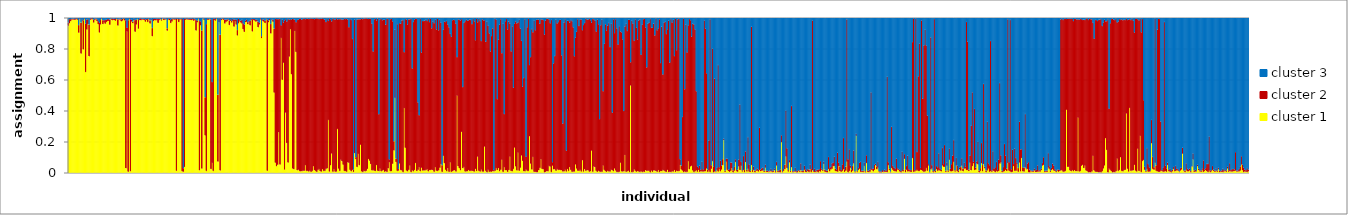
| Category | cluster 1 | cluster 2 | cluster 3 |
|---|---|---|---|
| 0 | 0.949 | 0.02 | 0.031 |
| 1 | 0.965 | 0.026 | 0.009 |
| 2 | 0.978 | 0.013 | 0.009 |
| 3 | 0.988 | 0.006 | 0.006 |
| 4 | 0.989 | 0.006 | 0.004 |
| 5 | 0.987 | 0.006 | 0.007 |
| 6 | 0.988 | 0.008 | 0.004 |
| 7 | 0.991 | 0.005 | 0.004 |
| 8 | 0.988 | 0.007 | 0.005 |
| 9 | 0.904 | 0.049 | 0.047 |
| 10 | 0.99 | 0.006 | 0.004 |
| 11 | 0.769 | 0.199 | 0.032 |
| 12 | 0.981 | 0.009 | 0.01 |
| 13 | 0.796 | 0.187 | 0.018 |
| 14 | 0.991 | 0.005 | 0.004 |
| 15 | 0.65 | 0.312 | 0.037 |
| 16 | 0.924 | 0.064 | 0.013 |
| 17 | 0.959 | 0.032 | 0.009 |
| 18 | 0.752 | 0.203 | 0.045 |
| 19 | 0.987 | 0.009 | 0.005 |
| 20 | 0.99 | 0.006 | 0.004 |
| 21 | 0.991 | 0.006 | 0.003 |
| 22 | 0.969 | 0.018 | 0.013 |
| 23 | 0.986 | 0.008 | 0.006 |
| 24 | 0.991 | 0.005 | 0.003 |
| 25 | 0.977 | 0.014 | 0.008 |
| 26 | 0.958 | 0.021 | 0.02 |
| 27 | 0.905 | 0.063 | 0.031 |
| 28 | 0.957 | 0.029 | 0.014 |
| 29 | 0.992 | 0.005 | 0.004 |
| 30 | 0.959 | 0.025 | 0.016 |
| 31 | 0.973 | 0.011 | 0.016 |
| 32 | 0.962 | 0.024 | 0.013 |
| 33 | 0.972 | 0.016 | 0.012 |
| 34 | 0.979 | 0.012 | 0.009 |
| 35 | 0.98 | 0.011 | 0.009 |
| 36 | 0.955 | 0.033 | 0.011 |
| 37 | 0.992 | 0.005 | 0.003 |
| 38 | 0.984 | 0.011 | 0.005 |
| 39 | 0.987 | 0.007 | 0.005 |
| 40 | 0.985 | 0.01 | 0.005 |
| 41 | 0.981 | 0.011 | 0.008 |
| 42 | 0.991 | 0.005 | 0.004 |
| 43 | 0.95 | 0.04 | 0.009 |
| 44 | 0.987 | 0.005 | 0.007 |
| 45 | 0.989 | 0.006 | 0.004 |
| 46 | 0.977 | 0.012 | 0.011 |
| 47 | 0.982 | 0.012 | 0.005 |
| 48 | 0.991 | 0.005 | 0.004 |
| 49 | 0.983 | 0.012 | 0.005 |
| 50 | 0.029 | 0.955 | 0.016 |
| 51 | 0.912 | 0.024 | 0.064 |
| 52 | 0.007 | 0.977 | 0.016 |
| 53 | 0.99 | 0.006 | 0.004 |
| 54 | 0.01 | 0.98 | 0.01 |
| 55 | 0.976 | 0.011 | 0.012 |
| 56 | 0.965 | 0.01 | 0.025 |
| 57 | 0.984 | 0.009 | 0.006 |
| 58 | 0.91 | 0.075 | 0.015 |
| 59 | 0.957 | 0.03 | 0.013 |
| 60 | 0.99 | 0.004 | 0.006 |
| 61 | 0.93 | 0.056 | 0.014 |
| 62 | 0.986 | 0.008 | 0.006 |
| 63 | 0.984 | 0.012 | 0.004 |
| 64 | 0.988 | 0.005 | 0.007 |
| 65 | 0.988 | 0.006 | 0.006 |
| 66 | 0.986 | 0.008 | 0.006 |
| 67 | 0.975 | 0.014 | 0.01 |
| 68 | 0.987 | 0.007 | 0.006 |
| 69 | 0.973 | 0.019 | 0.008 |
| 70 | 0.99 | 0.006 | 0.005 |
| 71 | 0.963 | 0.02 | 0.018 |
| 72 | 0.987 | 0.007 | 0.005 |
| 73 | 0.881 | 0.053 | 0.066 |
| 74 | 0.979 | 0.015 | 0.006 |
| 75 | 0.985 | 0.008 | 0.007 |
| 76 | 0.983 | 0.01 | 0.007 |
| 77 | 0.987 | 0.008 | 0.005 |
| 78 | 0.967 | 0.027 | 0.006 |
| 79 | 0.986 | 0.007 | 0.006 |
| 80 | 0.99 | 0.006 | 0.004 |
| 81 | 0.982 | 0.007 | 0.01 |
| 82 | 0.992 | 0.004 | 0.003 |
| 83 | 0.985 | 0.01 | 0.006 |
| 84 | 0.988 | 0.006 | 0.006 |
| 85 | 0.991 | 0.005 | 0.005 |
| 86 | 0.917 | 0.015 | 0.068 |
| 87 | 0.989 | 0.006 | 0.005 |
| 88 | 0.985 | 0.01 | 0.005 |
| 89 | 0.966 | 0.02 | 0.013 |
| 90 | 0.976 | 0.018 | 0.005 |
| 91 | 0.99 | 0.005 | 0.005 |
| 92 | 0.988 | 0.007 | 0.005 |
| 93 | 0.989 | 0.006 | 0.005 |
| 94 | 0.013 | 0.982 | 0.005 |
| 95 | 0.99 | 0.005 | 0.006 |
| 96 | 0.972 | 0.02 | 0.008 |
| 97 | 0.988 | 0.006 | 0.006 |
| 98 | 0.99 | 0.005 | 0.005 |
| 99 | 0.009 | 0.986 | 0.005 |
| 100 | 0.007 | 0.022 | 0.971 |
| 101 | 0.038 | 0.957 | 0.005 |
| 102 | 0.987 | 0.007 | 0.006 |
| 103 | 0.99 | 0.006 | 0.004 |
| 104 | 0.988 | 0.007 | 0.005 |
| 105 | 0.987 | 0.006 | 0.008 |
| 106 | 0.987 | 0.008 | 0.005 |
| 107 | 0.986 | 0.008 | 0.006 |
| 108 | 0.989 | 0.007 | 0.004 |
| 109 | 0.981 | 0.011 | 0.008 |
| 110 | 0.987 | 0.007 | 0.005 |
| 111 | 0.918 | 0.068 | 0.014 |
| 112 | 0.971 | 0.01 | 0.019 |
| 113 | 0.992 | 0.004 | 0.005 |
| 114 | 0.016 | 0.963 | 0.021 |
| 115 | 0.951 | 0.026 | 0.024 |
| 116 | 0.027 | 0.891 | 0.082 |
| 117 | 0.993 | 0.004 | 0.003 |
| 118 | 0.986 | 0.009 | 0.005 |
| 119 | 0.241 | 0.246 | 0.513 |
| 120 | 0.012 | 0.947 | 0.041 |
| 121 | 0.988 | 0.007 | 0.005 |
| 122 | 0.987 | 0.006 | 0.007 |
| 123 | 0.991 | 0.004 | 0.005 |
| 124 | 0.024 | 0.966 | 0.01 |
| 125 | 0.064 | 0.521 | 0.416 |
| 126 | 0.012 | 0.983 | 0.006 |
| 127 | 0.986 | 0.009 | 0.005 |
| 128 | 0.982 | 0.009 | 0.009 |
| 129 | 0.991 | 0.005 | 0.003 |
| 130 | 0.072 | 0.431 | 0.497 |
| 131 | 0.971 | 0.024 | 0.005 |
| 132 | 0.015 | 0.876 | 0.109 |
| 133 | 0.985 | 0.009 | 0.005 |
| 134 | 0.991 | 0.004 | 0.005 |
| 135 | 0.987 | 0.009 | 0.005 |
| 136 | 0.963 | 0.026 | 0.011 |
| 137 | 0.973 | 0.015 | 0.012 |
| 138 | 0.979 | 0.011 | 0.01 |
| 139 | 0.988 | 0.006 | 0.006 |
| 140 | 0.953 | 0.029 | 0.018 |
| 141 | 0.98 | 0.01 | 0.01 |
| 142 | 0.969 | 0.011 | 0.019 |
| 143 | 0.979 | 0.014 | 0.008 |
| 144 | 0.943 | 0.044 | 0.012 |
| 145 | 0.978 | 0.012 | 0.011 |
| 146 | 0.956 | 0.033 | 0.011 |
| 147 | 0.886 | 0.035 | 0.079 |
| 148 | 0.964 | 0.03 | 0.006 |
| 149 | 0.976 | 0.008 | 0.016 |
| 150 | 0.969 | 0.012 | 0.019 |
| 151 | 0.962 | 0.026 | 0.012 |
| 152 | 0.926 | 0.038 | 0.036 |
| 153 | 0.909 | 0.047 | 0.044 |
| 154 | 0.972 | 0.009 | 0.019 |
| 155 | 0.974 | 0.015 | 0.01 |
| 156 | 0.958 | 0.014 | 0.028 |
| 157 | 0.97 | 0.007 | 0.023 |
| 158 | 0.951 | 0.03 | 0.019 |
| 159 | 0.987 | 0.007 | 0.007 |
| 160 | 0.912 | 0.079 | 0.009 |
| 161 | 0.985 | 0.007 | 0.008 |
| 162 | 0.982 | 0.01 | 0.008 |
| 163 | 0.975 | 0.011 | 0.014 |
| 164 | 0.977 | 0.013 | 0.01 |
| 165 | 0.939 | 0.036 | 0.025 |
| 166 | 0.957 | 0.011 | 0.032 |
| 167 | 0.989 | 0.007 | 0.004 |
| 168 | 0.869 | 0.012 | 0.119 |
| 169 | 0.981 | 0.009 | 0.009 |
| 170 | 0.975 | 0.013 | 0.012 |
| 171 | 0.966 | 0.014 | 0.019 |
| 172 | 0.989 | 0.005 | 0.006 |
| 173 | 0.013 | 0.975 | 0.013 |
| 174 | 0.971 | 0.011 | 0.017 |
| 175 | 0.984 | 0.008 | 0.008 |
| 176 | 0.899 | 0.061 | 0.04 |
| 177 | 0.984 | 0.007 | 0.009 |
| 178 | 0.974 | 0.013 | 0.014 |
| 179 | 0.517 | 0.413 | 0.07 |
| 180 | 0.065 | 0.928 | 0.007 |
| 181 | 0.042 | 0.949 | 0.009 |
| 182 | 0.052 | 0.939 | 0.009 |
| 183 | 0.261 | 0.73 | 0.009 |
| 184 | 0.053 | 0.941 | 0.006 |
| 185 | 0.87 | 0.081 | 0.049 |
| 186 | 0.6 | 0.389 | 0.01 |
| 187 | 0.71 | 0.259 | 0.03 |
| 188 | 0.021 | 0.962 | 0.017 |
| 189 | 0.388 | 0.603 | 0.009 |
| 190 | 0.192 | 0.784 | 0.024 |
| 191 | 0.066 | 0.926 | 0.008 |
| 192 | 0.75 | 0.238 | 0.012 |
| 193 | 0.926 | 0.065 | 0.009 |
| 194 | 0.636 | 0.352 | 0.012 |
| 195 | 0.028 | 0.965 | 0.007 |
| 196 | 0.023 | 0.968 | 0.009 |
| 197 | 0.914 | 0.073 | 0.013 |
| 198 | 0.779 | 0.192 | 0.029 |
| 199 | 0.016 | 0.97 | 0.014 |
| 200 | 0.02 | 0.968 | 0.012 |
| 201 | 0.012 | 0.982 | 0.006 |
| 202 | 0.009 | 0.986 | 0.005 |
| 203 | 0.01 | 0.977 | 0.012 |
| 204 | 0.013 | 0.98 | 0.007 |
| 205 | 0.013 | 0.982 | 0.006 |
| 206 | 0.049 | 0.942 | 0.009 |
| 207 | 0.012 | 0.983 | 0.005 |
| 208 | 0.013 | 0.981 | 0.005 |
| 209 | 0.008 | 0.984 | 0.008 |
| 210 | 0.013 | 0.98 | 0.007 |
| 211 | 0.006 | 0.99 | 0.004 |
| 212 | 0.012 | 0.982 | 0.006 |
| 213 | 0.042 | 0.953 | 0.005 |
| 214 | 0.017 | 0.974 | 0.009 |
| 215 | 0.012 | 0.983 | 0.005 |
| 216 | 0.006 | 0.99 | 0.005 |
| 217 | 0.018 | 0.977 | 0.005 |
| 218 | 0.024 | 0.968 | 0.007 |
| 219 | 0.01 | 0.985 | 0.005 |
| 220 | 0.008 | 0.985 | 0.006 |
| 221 | 0.023 | 0.973 | 0.004 |
| 222 | 0.012 | 0.98 | 0.009 |
| 223 | 0.012 | 0.977 | 0.011 |
| 224 | 0.025 | 0.948 | 0.027 |
| 225 | 0.029 | 0.964 | 0.007 |
| 226 | 0.341 | 0.639 | 0.02 |
| 227 | 0.008 | 0.987 | 0.005 |
| 228 | 0.049 | 0.941 | 0.01 |
| 229 | 0.124 | 0.853 | 0.022 |
| 230 | 0.007 | 0.988 | 0.005 |
| 231 | 0.023 | 0.968 | 0.009 |
| 232 | 0.007 | 0.981 | 0.012 |
| 233 | 0.008 | 0.988 | 0.004 |
| 234 | 0.283 | 0.706 | 0.011 |
| 235 | 0.027 | 0.964 | 0.009 |
| 236 | 0.012 | 0.979 | 0.01 |
| 237 | 0.084 | 0.907 | 0.008 |
| 238 | 0.074 | 0.914 | 0.012 |
| 239 | 0.052 | 0.937 | 0.011 |
| 240 | 0.011 | 0.984 | 0.005 |
| 241 | 0.011 | 0.98 | 0.008 |
| 242 | 0.007 | 0.987 | 0.006 |
| 243 | 0.067 | 0.922 | 0.011 |
| 244 | 0.064 | 0.875 | 0.061 |
| 245 | 0.018 | 0.974 | 0.008 |
| 246 | 0.009 | 0.977 | 0.014 |
| 247 | 0.019 | 0.844 | 0.137 |
| 248 | 0.006 | 0.015 | 0.979 |
| 249 | 0.126 | 0.863 | 0.011 |
| 250 | 0.089 | 0.011 | 0.9 |
| 251 | 0.037 | 0.952 | 0.01 |
| 252 | 0.122 | 0.868 | 0.011 |
| 253 | 0.049 | 0.941 | 0.009 |
| 254 | 0.181 | 0.809 | 0.01 |
| 255 | 0.009 | 0.986 | 0.006 |
| 256 | 0.005 | 0.986 | 0.009 |
| 257 | 0.012 | 0.983 | 0.005 |
| 258 | 0.009 | 0.986 | 0.005 |
| 259 | 0.013 | 0.983 | 0.005 |
| 260 | 0.025 | 0.969 | 0.006 |
| 261 | 0.089 | 0.903 | 0.008 |
| 262 | 0.078 | 0.916 | 0.007 |
| 263 | 0.056 | 0.938 | 0.006 |
| 264 | 0.015 | 0.946 | 0.039 |
| 265 | 0.018 | 0.764 | 0.218 |
| 266 | 0.013 | 0.977 | 0.01 |
| 267 | 0.011 | 0.982 | 0.007 |
| 268 | 0.05 | 0.932 | 0.018 |
| 269 | 0.013 | 0.981 | 0.005 |
| 270 | 0.01 | 0.368 | 0.623 |
| 271 | 0.027 | 0.963 | 0.01 |
| 272 | 0.009 | 0.985 | 0.006 |
| 273 | 0.014 | 0.97 | 0.016 |
| 274 | 0.018 | 0.97 | 0.012 |
| 275 | 0.007 | 0.981 | 0.012 |
| 276 | 0.009 | 0.946 | 0.046 |
| 277 | 0.006 | 0.987 | 0.008 |
| 278 | 0.029 | 0.963 | 0.008 |
| 279 | 0.068 | 0.018 | 0.914 |
| 280 | 0.01 | 0.981 | 0.008 |
| 281 | 0.011 | 0.982 | 0.007 |
| 282 | 0.058 | 0.919 | 0.023 |
| 283 | 0.144 | 0.059 | 0.796 |
| 284 | 0.483 | 0.441 | 0.076 |
| 285 | 0.069 | 0.021 | 0.91 |
| 286 | 0.012 | 0.947 | 0.041 |
| 287 | 0.014 | 0.01 | 0.976 |
| 288 | 0.06 | 0.905 | 0.035 |
| 289 | 0.018 | 0.943 | 0.039 |
| 290 | 0.015 | 0.968 | 0.017 |
| 291 | 0.005 | 0.98 | 0.015 |
| 292 | 0.417 | 0.361 | 0.222 |
| 293 | 0.161 | 0.831 | 0.008 |
| 294 | 0.014 | 0.974 | 0.011 |
| 295 | 0.009 | 0.948 | 0.043 |
| 296 | 0.018 | 0.972 | 0.01 |
| 297 | 0.046 | 0.944 | 0.01 |
| 298 | 0.005 | 0.988 | 0.006 |
| 299 | 0.016 | 0.657 | 0.327 |
| 300 | 0.009 | 0.964 | 0.028 |
| 301 | 0.018 | 0.971 | 0.011 |
| 302 | 0.063 | 0.93 | 0.007 |
| 303 | 0.011 | 0.982 | 0.007 |
| 304 | 0.019 | 0.435 | 0.546 |
| 305 | 0.036 | 0.335 | 0.629 |
| 306 | 0.01 | 0.983 | 0.007 |
| 307 | 0.033 | 0.743 | 0.224 |
| 308 | 0.015 | 0.964 | 0.021 |
| 309 | 0.015 | 0.964 | 0.021 |
| 310 | 0.015 | 0.966 | 0.019 |
| 311 | 0.018 | 0.972 | 0.01 |
| 312 | 0.023 | 0.956 | 0.021 |
| 313 | 0.009 | 0.983 | 0.007 |
| 314 | 0.017 | 0.955 | 0.028 |
| 315 | 0.018 | 0.975 | 0.008 |
| 316 | 0.019 | 0.913 | 0.068 |
| 317 | 0.017 | 0.96 | 0.024 |
| 318 | 0.007 | 0.958 | 0.035 |
| 319 | 0.036 | 0.953 | 0.011 |
| 320 | 0.013 | 0.912 | 0.075 |
| 321 | 0.012 | 0.981 | 0.008 |
| 322 | 0.015 | 0.904 | 0.08 |
| 323 | 0.032 | 0.954 | 0.013 |
| 324 | 0.056 | 0.912 | 0.032 |
| 325 | 0.006 | 0.043 | 0.951 |
| 326 | 0.109 | 0.813 | 0.077 |
| 327 | 0.062 | 0.914 | 0.024 |
| 328 | 0.02 | 0.952 | 0.028 |
| 329 | 0.009 | 0.97 | 0.021 |
| 330 | 0.029 | 0.928 | 0.044 |
| 331 | 0.006 | 0.932 | 0.062 |
| 332 | 0.067 | 0.829 | 0.104 |
| 333 | 0.006 | 0.871 | 0.123 |
| 334 | 0.01 | 0.974 | 0.016 |
| 335 | 0.015 | 0.972 | 0.013 |
| 336 | 0.016 | 0.969 | 0.015 |
| 337 | 0.008 | 0.953 | 0.039 |
| 338 | 0.498 | 0.248 | 0.254 |
| 339 | 0.042 | 0.948 | 0.01 |
| 340 | 0.029 | 0.957 | 0.014 |
| 341 | 0.016 | 0.966 | 0.018 |
| 342 | 0.264 | 0.727 | 0.01 |
| 343 | 0.029 | 0.524 | 0.447 |
| 344 | 0.037 | 0.93 | 0.033 |
| 345 | 0.008 | 0.97 | 0.022 |
| 346 | 0.009 | 0.98 | 0.011 |
| 347 | 0.01 | 0.971 | 0.019 |
| 348 | 0.018 | 0.965 | 0.018 |
| 349 | 0.012 | 0.977 | 0.011 |
| 350 | 0.012 | 0.974 | 0.014 |
| 351 | 0.013 | 0.946 | 0.041 |
| 352 | 0.01 | 0.983 | 0.008 |
| 353 | 0.008 | 0.969 | 0.024 |
| 354 | 0.025 | 0.83 | 0.145 |
| 355 | 0.011 | 0.982 | 0.007 |
| 356 | 0.104 | 0.867 | 0.029 |
| 357 | 0.012 | 0.982 | 0.006 |
| 358 | 0.008 | 0.971 | 0.021 |
| 359 | 0.021 | 0.829 | 0.15 |
| 360 | 0.008 | 0.982 | 0.011 |
| 361 | 0.008 | 0.975 | 0.017 |
| 362 | 0.169 | 0.815 | 0.016 |
| 363 | 0.012 | 0.833 | 0.155 |
| 364 | 0.004 | 0.972 | 0.024 |
| 365 | 0.02 | 0.928 | 0.051 |
| 366 | 0.006 | 0.893 | 0.102 |
| 367 | 0.008 | 0.775 | 0.217 |
| 368 | 0.007 | 0.875 | 0.118 |
| 369 | 0.01 | 0.922 | 0.068 |
| 370 | 0.009 | 0.009 | 0.981 |
| 371 | 0.013 | 0.981 | 0.006 |
| 372 | 0.03 | 0.957 | 0.013 |
| 373 | 0.017 | 0.458 | 0.525 |
| 374 | 0.03 | 0.829 | 0.14 |
| 375 | 0.01 | 0.946 | 0.044 |
| 376 | 0.019 | 0.972 | 0.009 |
| 377 | 0.084 | 0.687 | 0.229 |
| 378 | 0.006 | 0.956 | 0.038 |
| 379 | 0.036 | 0.343 | 0.621 |
| 380 | 0.016 | 0.962 | 0.022 |
| 381 | 0.016 | 0.976 | 0.008 |
| 382 | 0.006 | 0.919 | 0.075 |
| 383 | 0.017 | 0.959 | 0.025 |
| 384 | 0.104 | 0.859 | 0.036 |
| 385 | 0.011 | 0.772 | 0.218 |
| 386 | 0.01 | 0.935 | 0.055 |
| 387 | 0.025 | 0.524 | 0.451 |
| 388 | 0.163 | 0.798 | 0.039 |
| 389 | 0.041 | 0.936 | 0.024 |
| 390 | 0.015 | 0.949 | 0.035 |
| 391 | 0.13 | 0.84 | 0.029 |
| 392 | 0.013 | 0.974 | 0.012 |
| 393 | 0.033 | 0.898 | 0.069 |
| 394 | 0.112 | 0.739 | 0.149 |
| 395 | 0.077 | 0.478 | 0.445 |
| 396 | 0.01 | 0.601 | 0.389 |
| 397 | 0.009 | 0.982 | 0.009 |
| 398 | 0.021 | 0.083 | 0.896 |
| 399 | 0.012 | 0.927 | 0.061 |
| 400 | 0.012 | 0.981 | 0.007 |
| 401 | 0.236 | 0.459 | 0.305 |
| 402 | 0.059 | 0.687 | 0.254 |
| 403 | 0.021 | 0.906 | 0.073 |
| 404 | 0.102 | 0.804 | 0.094 |
| 405 | 0.006 | 0.975 | 0.019 |
| 406 | 0.006 | 0.914 | 0.08 |
| 407 | 0.005 | 0.982 | 0.013 |
| 408 | 0.005 | 0.984 | 0.011 |
| 409 | 0.016 | 0.973 | 0.011 |
| 410 | 0.031 | 0.931 | 0.038 |
| 411 | 0.087 | 0.903 | 0.01 |
| 412 | 0.024 | 0.965 | 0.011 |
| 413 | 0.023 | 0.962 | 0.015 |
| 414 | 0.004 | 0.888 | 0.108 |
| 415 | 0.006 | 0.975 | 0.019 |
| 416 | 0.01 | 0.983 | 0.008 |
| 417 | 0.009 | 0.985 | 0.007 |
| 418 | 0.044 | 0.945 | 0.011 |
| 419 | 0.04 | 0.925 | 0.035 |
| 420 | 0.005 | 0.981 | 0.014 |
| 421 | 0.046 | 0.022 | 0.932 |
| 422 | 0.022 | 0.684 | 0.294 |
| 423 | 0.023 | 0.73 | 0.247 |
| 424 | 0.013 | 0.975 | 0.012 |
| 425 | 0.024 | 0.939 | 0.037 |
| 426 | 0.018 | 0.954 | 0.028 |
| 427 | 0.019 | 0.967 | 0.013 |
| 428 | 0.018 | 0.969 | 0.013 |
| 429 | 0.016 | 0.742 | 0.241 |
| 430 | 0.008 | 0.309 | 0.683 |
| 431 | 0.009 | 0.96 | 0.031 |
| 432 | 0.02 | 0.971 | 0.009 |
| 433 | 0.008 | 0.135 | 0.858 |
| 434 | 0.024 | 0.957 | 0.019 |
| 435 | 0.012 | 0.967 | 0.021 |
| 436 | 0.036 | 0.933 | 0.03 |
| 437 | 0.018 | 0.967 | 0.015 |
| 438 | 0.006 | 0.972 | 0.022 |
| 439 | 0.008 | 0.93 | 0.062 |
| 440 | 0.008 | 0.744 | 0.248 |
| 441 | 0.054 | 0.819 | 0.127 |
| 442 | 0.027 | 0.882 | 0.091 |
| 443 | 0.013 | 0.978 | 0.009 |
| 444 | 0.012 | 0.935 | 0.054 |
| 445 | 0.019 | 0.971 | 0.01 |
| 446 | 0.008 | 0.981 | 0.012 |
| 447 | 0.081 | 0.839 | 0.08 |
| 448 | 0.008 | 0.945 | 0.046 |
| 449 | 0.023 | 0.943 | 0.034 |
| 450 | 0.012 | 0.982 | 0.006 |
| 451 | 0.016 | 0.973 | 0.011 |
| 452 | 0.016 | 0.972 | 0.011 |
| 453 | 0.007 | 0.987 | 0.006 |
| 454 | 0.01 | 0.974 | 0.016 |
| 455 | 0.143 | 0.826 | 0.031 |
| 456 | 0.007 | 0.985 | 0.008 |
| 457 | 0.04 | 0.951 | 0.009 |
| 458 | 0.036 | 0.945 | 0.019 |
| 459 | 0.012 | 0.899 | 0.089 |
| 460 | 0.006 | 0.982 | 0.012 |
| 461 | 0.013 | 0.945 | 0.042 |
| 462 | 0.008 | 0.338 | 0.654 |
| 463 | 0.006 | 0.946 | 0.048 |
| 464 | 0.007 | 0.981 | 0.012 |
| 465 | 0.047 | 0.479 | 0.474 |
| 466 | 0.018 | 0.815 | 0.166 |
| 467 | 0.01 | 0.948 | 0.042 |
| 468 | 0.006 | 0.91 | 0.084 |
| 469 | 0.012 | 0.936 | 0.052 |
| 470 | 0.008 | 0.958 | 0.034 |
| 471 | 0.008 | 0.803 | 0.188 |
| 472 | 0.02 | 0.942 | 0.039 |
| 473 | 0.016 | 0.372 | 0.612 |
| 474 | 0.01 | 0.98 | 0.009 |
| 475 | 0.028 | 0.873 | 0.099 |
| 476 | 0.014 | 0.977 | 0.01 |
| 477 | 0.005 | 0.927 | 0.068 |
| 478 | 0.005 | 0.822 | 0.173 |
| 479 | 0.007 | 0.939 | 0.054 |
| 480 | 0.065 | 0.846 | 0.089 |
| 481 | 0.009 | 0.897 | 0.093 |
| 482 | 0.008 | 0.853 | 0.139 |
| 483 | 0.009 | 0.39 | 0.601 |
| 484 | 0.114 | 0.83 | 0.056 |
| 485 | 0.006 | 0.956 | 0.038 |
| 486 | 0.009 | 0.906 | 0.086 |
| 487 | 0.013 | 0.974 | 0.013 |
| 488 | 0.005 | 0.982 | 0.012 |
| 489 | 0.563 | 0.15 | 0.287 |
| 490 | 0.004 | 0.976 | 0.02 |
| 491 | 0.006 | 0.956 | 0.038 |
| 492 | 0.022 | 0.829 | 0.149 |
| 493 | 0.012 | 0.978 | 0.01 |
| 494 | 0.007 | 0.928 | 0.065 |
| 495 | 0.011 | 0.849 | 0.14 |
| 496 | 0.008 | 0.974 | 0.018 |
| 497 | 0.005 | 0.984 | 0.011 |
| 498 | 0.01 | 0.751 | 0.239 |
| 499 | 0.005 | 0.951 | 0.044 |
| 500 | 0.008 | 0.983 | 0.008 |
| 501 | 0.006 | 0.987 | 0.007 |
| 502 | 0.016 | 0.922 | 0.062 |
| 503 | 0.012 | 0.668 | 0.32 |
| 504 | 0.013 | 0.949 | 0.038 |
| 505 | 0.013 | 0.955 | 0.032 |
| 506 | 0.003 | 0.989 | 0.007 |
| 507 | 0.014 | 0.921 | 0.065 |
| 508 | 0.006 | 0.929 | 0.065 |
| 509 | 0.015 | 0.947 | 0.037 |
| 510 | 0.015 | 0.871 | 0.115 |
| 511 | 0.01 | 0.984 | 0.007 |
| 512 | 0.007 | 0.912 | 0.081 |
| 513 | 0.017 | 0.915 | 0.068 |
| 514 | 0.005 | 0.985 | 0.011 |
| 515 | 0.011 | 0.697 | 0.292 |
| 516 | 0.01 | 0.932 | 0.058 |
| 517 | 0.018 | 0.616 | 0.366 |
| 518 | 0.014 | 0.955 | 0.031 |
| 519 | 0.008 | 0.966 | 0.025 |
| 520 | 0.006 | 0.889 | 0.105 |
| 521 | 0.019 | 0.907 | 0.073 |
| 522 | 0.005 | 0.976 | 0.019 |
| 523 | 0.006 | 0.705 | 0.289 |
| 524 | 0.005 | 0.987 | 0.008 |
| 525 | 0.009 | 0.96 | 0.031 |
| 526 | 0.008 | 0.979 | 0.013 |
| 527 | 0.017 | 0.736 | 0.247 |
| 528 | 0.006 | 0.988 | 0.006 |
| 529 | 0.013 | 0.778 | 0.209 |
| 530 | 0.009 | 0.981 | 0.01 |
| 531 | 0.011 | 0.983 | 0.006 |
| 532 | 0.049 | 0.038 | 0.913 |
| 533 | 0.021 | 0.025 | 0.954 |
| 534 | 0.014 | 0.346 | 0.639 |
| 535 | 0.005 | 0.989 | 0.006 |
| 536 | 0.008 | 0.531 | 0.461 |
| 537 | 0.005 | 0.952 | 0.043 |
| 538 | 0.007 | 0.769 | 0.224 |
| 539 | 0.075 | 0.876 | 0.05 |
| 540 | 0.023 | 0.969 | 0.008 |
| 541 | 0.041 | 0.943 | 0.016 |
| 542 | 0.045 | 0.833 | 0.122 |
| 543 | 0.015 | 0.946 | 0.039 |
| 544 | 0.005 | 0.952 | 0.043 |
| 545 | 0.01 | 0.915 | 0.075 |
| 546 | 0.016 | 0.51 | 0.473 |
| 547 | 0.007 | 0.034 | 0.959 |
| 548 | 0.019 | 0.011 | 0.97 |
| 549 | 0.006 | 0.04 | 0.954 |
| 550 | 0.009 | 0.01 | 0.981 |
| 551 | 0.008 | 0.063 | 0.929 |
| 552 | 0.008 | 0.013 | 0.978 |
| 553 | 0.009 | 0.974 | 0.017 |
| 554 | 0.01 | 0.919 | 0.071 |
| 555 | 0.028 | 0.614 | 0.357 |
| 556 | 0.006 | 0.014 | 0.98 |
| 557 | 0.015 | 0.193 | 0.792 |
| 558 | 0.005 | 0.986 | 0.009 |
| 559 | 0.026 | 0.022 | 0.952 |
| 560 | 0.075 | 0.726 | 0.199 |
| 561 | 0.004 | 0.034 | 0.962 |
| 562 | 0.008 | 0.6 | 0.392 |
| 563 | 0.005 | 0.005 | 0.99 |
| 564 | 0.019 | 0.012 | 0.969 |
| 565 | 0.008 | 0.687 | 0.305 |
| 566 | 0.025 | 0.01 | 0.965 |
| 567 | 0.009 | 0.07 | 0.921 |
| 568 | 0.021 | 0.025 | 0.954 |
| 569 | 0.049 | 0.039 | 0.912 |
| 570 | 0.21 | 0.01 | 0.78 |
| 571 | 0.006 | 0.008 | 0.986 |
| 572 | 0.072 | 0.02 | 0.908 |
| 573 | 0.018 | 0.072 | 0.91 |
| 574 | 0.011 | 0.009 | 0.98 |
| 575 | 0.006 | 0.017 | 0.976 |
| 576 | 0.012 | 0.055 | 0.933 |
| 577 | 0.029 | 0.036 | 0.935 |
| 578 | 0.004 | 0.012 | 0.983 |
| 579 | 0.013 | 0.025 | 0.962 |
| 580 | 0.069 | 0.018 | 0.913 |
| 581 | 0.01 | 0.007 | 0.983 |
| 582 | 0.007 | 0.014 | 0.98 |
| 583 | 0.041 | 0.043 | 0.916 |
| 584 | 0.017 | 0.424 | 0.559 |
| 585 | 0.045 | 0.025 | 0.93 |
| 586 | 0.008 | 0.008 | 0.983 |
| 587 | 0.018 | 0.09 | 0.893 |
| 588 | 0.005 | 0.013 | 0.982 |
| 589 | 0.068 | 0.07 | 0.862 |
| 590 | 0.008 | 0.01 | 0.982 |
| 591 | 0.026 | 0.204 | 0.77 |
| 592 | 0.007 | 0.046 | 0.947 |
| 593 | 0.006 | 0.007 | 0.986 |
| 594 | 0.05 | 0.892 | 0.058 |
| 595 | 0.006 | 0.012 | 0.981 |
| 596 | 0.018 | 0.022 | 0.96 |
| 597 | 0.004 | 0.009 | 0.987 |
| 598 | 0.013 | 0.008 | 0.979 |
| 599 | 0.014 | 0.013 | 0.973 |
| 600 | 0.008 | 0.011 | 0.981 |
| 601 | 0.018 | 0.273 | 0.709 |
| 602 | 0.01 | 0.011 | 0.979 |
| 603 | 0.013 | 0.016 | 0.972 |
| 604 | 0.015 | 0.019 | 0.967 |
| 605 | 0.006 | 0.007 | 0.987 |
| 606 | 0.033 | 0.02 | 0.947 |
| 607 | 0.006 | 0.007 | 0.988 |
| 608 | 0.006 | 0.009 | 0.985 |
| 609 | 0.005 | 0.005 | 0.99 |
| 610 | 0.008 | 0.005 | 0.987 |
| 611 | 0.01 | 0.016 | 0.974 |
| 612 | 0.005 | 0.007 | 0.988 |
| 613 | 0.006 | 0.008 | 0.986 |
| 614 | 0.018 | 0.01 | 0.971 |
| 615 | 0.003 | 0.007 | 0.99 |
| 616 | 0.046 | 0.024 | 0.93 |
| 617 | 0.005 | 0.007 | 0.988 |
| 618 | 0.005 | 0.011 | 0.984 |
| 619 | 0.004 | 0.017 | 0.979 |
| 620 | 0.197 | 0.045 | 0.758 |
| 621 | 0.004 | 0.006 | 0.989 |
| 622 | 0.012 | 0.012 | 0.976 |
| 623 | 0.023 | 0.029 | 0.948 |
| 624 | 0.105 | 0.296 | 0.599 |
| 625 | 0.03 | 0.127 | 0.843 |
| 626 | 0.008 | 0.009 | 0.983 |
| 627 | 0.067 | 0.015 | 0.918 |
| 628 | 0.006 | 0.007 | 0.987 |
| 629 | 0.035 | 0.396 | 0.569 |
| 630 | 0.003 | 0.007 | 0.989 |
| 631 | 0.006 | 0.005 | 0.988 |
| 632 | 0.008 | 0.024 | 0.968 |
| 633 | 0.004 | 0.006 | 0.99 |
| 634 | 0.004 | 0.008 | 0.988 |
| 635 | 0.011 | 0.006 | 0.983 |
| 636 | 0.006 | 0.008 | 0.987 |
| 637 | 0.016 | 0.045 | 0.939 |
| 638 | 0.005 | 0.008 | 0.987 |
| 639 | 0.005 | 0.01 | 0.985 |
| 640 | 0.019 | 0.026 | 0.955 |
| 641 | 0.006 | 0.016 | 0.979 |
| 642 | 0.005 | 0.007 | 0.989 |
| 643 | 0.01 | 0.014 | 0.977 |
| 644 | 0.005 | 0.015 | 0.98 |
| 645 | 0.023 | 0.03 | 0.947 |
| 646 | 0.005 | 0.019 | 0.976 |
| 647 | 0.016 | 0.967 | 0.018 |
| 648 | 0.007 | 0.005 | 0.988 |
| 649 | 0.005 | 0.02 | 0.975 |
| 650 | 0.005 | 0.007 | 0.988 |
| 651 | 0.01 | 0.009 | 0.981 |
| 652 | 0.003 | 0.018 | 0.978 |
| 653 | 0.011 | 0.012 | 0.976 |
| 654 | 0.008 | 0.067 | 0.925 |
| 655 | 0.02 | 0.006 | 0.973 |
| 656 | 0.011 | 0.007 | 0.982 |
| 657 | 0.056 | 0.015 | 0.929 |
| 658 | 0.006 | 0.013 | 0.98 |
| 659 | 0.005 | 0.009 | 0.986 |
| 660 | 0.004 | 0.01 | 0.986 |
| 661 | 0.024 | 0.078 | 0.898 |
| 662 | 0.009 | 0.021 | 0.971 |
| 663 | 0.021 | 0.016 | 0.963 |
| 664 | 0.026 | 0.035 | 0.939 |
| 665 | 0.043 | 0.022 | 0.935 |
| 666 | 0.043 | 0.061 | 0.895 |
| 667 | 0.011 | 0.016 | 0.973 |
| 668 | 0.01 | 0.009 | 0.981 |
| 669 | 0.007 | 0.123 | 0.871 |
| 670 | 0.043 | 0.022 | 0.935 |
| 671 | 0.01 | 0.031 | 0.958 |
| 672 | 0.007 | 0.011 | 0.982 |
| 673 | 0.012 | 0.042 | 0.946 |
| 674 | 0.022 | 0.202 | 0.776 |
| 675 | 0.006 | 0.016 | 0.978 |
| 676 | 0.013 | 0.027 | 0.96 |
| 677 | 0.071 | 0.919 | 0.009 |
| 678 | 0.004 | 0.082 | 0.914 |
| 679 | 0.011 | 0.141 | 0.848 |
| 680 | 0.032 | 0.013 | 0.955 |
| 681 | 0.005 | 0.016 | 0.979 |
| 682 | 0.013 | 0.031 | 0.956 |
| 683 | 0.06 | 0.084 | 0.856 |
| 684 | 0.003 | 0.005 | 0.992 |
| 685 | 0.238 | 0.013 | 0.749 |
| 686 | 0.005 | 0.006 | 0.989 |
| 687 | 0.018 | 0.013 | 0.969 |
| 688 | 0.026 | 0.039 | 0.936 |
| 689 | 0.006 | 0.064 | 0.93 |
| 690 | 0.006 | 0.007 | 0.987 |
| 691 | 0.005 | 0.008 | 0.988 |
| 692 | 0.044 | 0.021 | 0.935 |
| 693 | 0.004 | 0.006 | 0.99 |
| 694 | 0.063 | 0.05 | 0.887 |
| 695 | 0.007 | 0.008 | 0.986 |
| 696 | 0.005 | 0.008 | 0.987 |
| 697 | 0.007 | 0.015 | 0.978 |
| 698 | 0.019 | 0.5 | 0.481 |
| 699 | 0.018 | 0.007 | 0.976 |
| 700 | 0.009 | 0.018 | 0.973 |
| 701 | 0.019 | 0.033 | 0.948 |
| 702 | 0.048 | 0.01 | 0.942 |
| 703 | 0.022 | 0.019 | 0.959 |
| 704 | 0.033 | 0.037 | 0.93 |
| 705 | 0.004 | 0.006 | 0.991 |
| 706 | 0.004 | 0.005 | 0.99 |
| 707 | 0.003 | 0.005 | 0.992 |
| 708 | 0.006 | 0.011 | 0.984 |
| 709 | 0.005 | 0.005 | 0.99 |
| 710 | 0.006 | 0.015 | 0.979 |
| 711 | 0.006 | 0.007 | 0.987 |
| 712 | 0.005 | 0.615 | 0.38 |
| 713 | 0.049 | 0.019 | 0.932 |
| 714 | 0.018 | 0.008 | 0.975 |
| 715 | 0.004 | 0.004 | 0.991 |
| 716 | 0.03 | 0.266 | 0.703 |
| 717 | 0.019 | 0.025 | 0.955 |
| 718 | 0.01 | 0.023 | 0.967 |
| 719 | 0.01 | 0.015 | 0.975 |
| 720 | 0.008 | 0.084 | 0.908 |
| 721 | 0.021 | 0.008 | 0.971 |
| 722 | 0.018 | 0.007 | 0.974 |
| 723 | 0.008 | 0.011 | 0.981 |
| 724 | 0.003 | 0.008 | 0.989 |
| 725 | 0.011 | 0.125 | 0.864 |
| 726 | 0.009 | 0.009 | 0.981 |
| 727 | 0.09 | 0.03 | 0.88 |
| 728 | 0.005 | 0.016 | 0.979 |
| 729 | 0.019 | 0.025 | 0.957 |
| 730 | 0.008 | 0.102 | 0.89 |
| 731 | 0.01 | 0.012 | 0.978 |
| 732 | 0.007 | 0.01 | 0.983 |
| 733 | 0.006 | 0.011 | 0.983 |
| 734 | 0.095 | 0.748 | 0.157 |
| 735 | 0.007 | 0.988 | 0.005 |
| 736 | 0.008 | 0.009 | 0.984 |
| 737 | 0.013 | 0.982 | 0.005 |
| 738 | 0.019 | 0.115 | 0.866 |
| 739 | 0.011 | 0.611 | 0.378 |
| 740 | 0.012 | 0.822 | 0.167 |
| 741 | 0.02 | 0.011 | 0.968 |
| 742 | 0.017 | 0.966 | 0.016 |
| 743 | 0.012 | 0.465 | 0.523 |
| 744 | 0.006 | 0.816 | 0.178 |
| 745 | 0.009 | 0.914 | 0.077 |
| 746 | 0.031 | 0.79 | 0.18 |
| 747 | 0.013 | 0.356 | 0.631 |
| 748 | 0.047 | 0.008 | 0.945 |
| 749 | 0.003 | 0.004 | 0.992 |
| 750 | 0.021 | 0.853 | 0.126 |
| 751 | 0.028 | 0.021 | 0.95 |
| 752 | 0.004 | 0.007 | 0.988 |
| 753 | 0.01 | 0.982 | 0.008 |
| 754 | 0.005 | 0.008 | 0.987 |
| 755 | 0.023 | 0.02 | 0.957 |
| 756 | 0.012 | 0.024 | 0.964 |
| 757 | 0.018 | 0.108 | 0.875 |
| 758 | 0.013 | 0.015 | 0.972 |
| 759 | 0.009 | 0.01 | 0.981 |
| 760 | 0.047 | 0.113 | 0.84 |
| 761 | 0.039 | 0.017 | 0.945 |
| 762 | 0.038 | 0.141 | 0.822 |
| 763 | 0.006 | 0.007 | 0.987 |
| 764 | 0.045 | 0.022 | 0.933 |
| 765 | 0.007 | 0.008 | 0.985 |
| 766 | 0.084 | 0.073 | 0.843 |
| 767 | 0.01 | 0.016 | 0.974 |
| 768 | 0.009 | 0.046 | 0.944 |
| 769 | 0.011 | 0.099 | 0.89 |
| 770 | 0.07 | 0.141 | 0.789 |
| 771 | 0.008 | 0.008 | 0.984 |
| 772 | 0.046 | 0.05 | 0.903 |
| 773 | 0.009 | 0.036 | 0.955 |
| 774 | 0.005 | 0.01 | 0.985 |
| 775 | 0.022 | 0.012 | 0.966 |
| 776 | 0.014 | 0.023 | 0.963 |
| 777 | 0.045 | 0.049 | 0.906 |
| 778 | 0.01 | 0.018 | 0.972 |
| 779 | 0.027 | 0.038 | 0.935 |
| 780 | 0.028 | 0.01 | 0.963 |
| 781 | 0.017 | 0.956 | 0.027 |
| 782 | 0.018 | 0.828 | 0.153 |
| 783 | 0.011 | 0.01 | 0.979 |
| 784 | 0.065 | 0.045 | 0.89 |
| 785 | 0.016 | 0.287 | 0.697 |
| 786 | 0.043 | 0.476 | 0.481 |
| 787 | 0.062 | 0.009 | 0.929 |
| 788 | 0.018 | 0.394 | 0.588 |
| 789 | 0.02 | 0.013 | 0.966 |
| 790 | 0.059 | 0.014 | 0.927 |
| 791 | 0.054 | 0.146 | 0.8 |
| 792 | 0.004 | 0.011 | 0.985 |
| 793 | 0.012 | 0.018 | 0.97 |
| 794 | 0.061 | 0.131 | 0.808 |
| 795 | 0.01 | 0.04 | 0.95 |
| 796 | 0.056 | 0.517 | 0.426 |
| 797 | 0.028 | 0.01 | 0.962 |
| 798 | 0.005 | 0.01 | 0.985 |
| 799 | 0.015 | 0.315 | 0.67 |
| 800 | 0.027 | 0.034 | 0.939 |
| 801 | 0.007 | 0.042 | 0.951 |
| 802 | 0.01 | 0.84 | 0.15 |
| 803 | 0.007 | 0.009 | 0.984 |
| 804 | 0.014 | 0.125 | 0.861 |
| 805 | 0.01 | 0.017 | 0.973 |
| 806 | 0.005 | 0.031 | 0.964 |
| 807 | 0.012 | 0.058 | 0.93 |
| 808 | 0.008 | 0.01 | 0.982 |
| 809 | 0.011 | 0.073 | 0.916 |
| 810 | 0.059 | 0.52 | 0.421 |
| 811 | 0.067 | 0.045 | 0.888 |
| 812 | 0.005 | 0.008 | 0.987 |
| 813 | 0.008 | 0.029 | 0.963 |
| 814 | 0.01 | 0.176 | 0.815 |
| 815 | 0.019 | 0.092 | 0.889 |
| 816 | 0.011 | 0.016 | 0.973 |
| 817 | 0.062 | 0.929 | 0.009 |
| 818 | 0.013 | 0.054 | 0.933 |
| 819 | 0.008 | 0.978 | 0.014 |
| 820 | 0.005 | 0.017 | 0.978 |
| 821 | 0.007 | 0.142 | 0.851 |
| 822 | 0.044 | 0.012 | 0.944 |
| 823 | 0.012 | 0.143 | 0.845 |
| 824 | 0.013 | 0.082 | 0.905 |
| 825 | 0.056 | 0.007 | 0.937 |
| 826 | 0.007 | 0.024 | 0.969 |
| 827 | 0.066 | 0.263 | 0.671 |
| 828 | 0.009 | 0.141 | 0.85 |
| 829 | 0.095 | 0.057 | 0.848 |
| 830 | 0.009 | 0.027 | 0.964 |
| 831 | 0.008 | 0.024 | 0.968 |
| 832 | 0.036 | 0.343 | 0.622 |
| 833 | 0.022 | 0.005 | 0.974 |
| 834 | 0.024 | 0.036 | 0.941 |
| 835 | 0.005 | 0.063 | 0.932 |
| 836 | 0.003 | 0.016 | 0.981 |
| 837 | 0.011 | 0.005 | 0.985 |
| 838 | 0.006 | 0.006 | 0.988 |
| 839 | 0.007 | 0.007 | 0.986 |
| 840 | 0.015 | 0.013 | 0.972 |
| 841 | 0.006 | 0.01 | 0.984 |
| 842 | 0.006 | 0.012 | 0.982 |
| 843 | 0.007 | 0.041 | 0.952 |
| 844 | 0.008 | 0.007 | 0.985 |
| 845 | 0.008 | 0.01 | 0.982 |
| 846 | 0.017 | 0.009 | 0.974 |
| 847 | 0.046 | 0.017 | 0.937 |
| 848 | 0.051 | 0.049 | 0.9 |
| 849 | 0.005 | 0.007 | 0.988 |
| 850 | 0.007 | 0.007 | 0.987 |
| 851 | 0.006 | 0.008 | 0.986 |
| 852 | 0.034 | 0.093 | 0.873 |
| 853 | 0.025 | 0.017 | 0.958 |
| 854 | 0.006 | 0.008 | 0.986 |
| 855 | 0.018 | 0.013 | 0.969 |
| 856 | 0.023 | 0.036 | 0.941 |
| 857 | 0.014 | 0.032 | 0.954 |
| 858 | 0.011 | 0.011 | 0.978 |
| 859 | 0.005 | 0.007 | 0.988 |
| 860 | 0.014 | 0.007 | 0.979 |
| 861 | 0.007 | 0.014 | 0.979 |
| 862 | 0.011 | 0.007 | 0.981 |
| 863 | 0.014 | 0.975 | 0.011 |
| 864 | 0.017 | 0.977 | 0.007 |
| 865 | 0.007 | 0.979 | 0.014 |
| 866 | 0.008 | 0.987 | 0.005 |
| 867 | 0.012 | 0.981 | 0.007 |
| 868 | 0.407 | 0.585 | 0.008 |
| 869 | 0.038 | 0.956 | 0.006 |
| 870 | 0.038 | 0.956 | 0.006 |
| 871 | 0.015 | 0.98 | 0.005 |
| 872 | 0.01 | 0.983 | 0.007 |
| 873 | 0.017 | 0.977 | 0.007 |
| 874 | 0.01 | 0.969 | 0.021 |
| 875 | 0.017 | 0.976 | 0.007 |
| 876 | 0.01 | 0.983 | 0.007 |
| 877 | 0.01 | 0.979 | 0.011 |
| 878 | 0.356 | 0.635 | 0.01 |
| 879 | 0.008 | 0.98 | 0.012 |
| 880 | 0.012 | 0.98 | 0.007 |
| 881 | 0.045 | 0.946 | 0.009 |
| 882 | 0.051 | 0.935 | 0.014 |
| 883 | 0.03 | 0.958 | 0.012 |
| 884 | 0.046 | 0.94 | 0.014 |
| 885 | 0.014 | 0.98 | 0.007 |
| 886 | 0.01 | 0.986 | 0.004 |
| 887 | 0.004 | 0.982 | 0.014 |
| 888 | 0.005 | 0.989 | 0.006 |
| 889 | 0.003 | 0.988 | 0.009 |
| 890 | 0.008 | 0.982 | 0.01 |
| 891 | 0.109 | 0.858 | 0.033 |
| 892 | 0.015 | 0.85 | 0.135 |
| 893 | 0.007 | 0.979 | 0.014 |
| 894 | 0.006 | 0.979 | 0.015 |
| 895 | 0.006 | 0.973 | 0.021 |
| 896 | 0.003 | 0.983 | 0.013 |
| 897 | 0.004 | 0.984 | 0.012 |
| 898 | 0.004 | 0.988 | 0.008 |
| 899 | 0.01 | 0.937 | 0.053 |
| 900 | 0.028 | 0.942 | 0.03 |
| 901 | 0.047 | 0.941 | 0.012 |
| 902 | 0.223 | 0.754 | 0.023 |
| 903 | 0.147 | 0.831 | 0.022 |
| 904 | 0.003 | 0.988 | 0.009 |
| 905 | 0.027 | 0.386 | 0.587 |
| 906 | 0.018 | 0.947 | 0.036 |
| 907 | 0.01 | 0.982 | 0.008 |
| 908 | 0.003 | 0.991 | 0.005 |
| 909 | 0.005 | 0.983 | 0.013 |
| 910 | 0.004 | 0.981 | 0.015 |
| 911 | 0.01 | 0.984 | 0.006 |
| 912 | 0.092 | 0.878 | 0.031 |
| 913 | 0.012 | 0.964 | 0.024 |
| 914 | 0.018 | 0.973 | 0.009 |
| 915 | 0.1 | 0.886 | 0.013 |
| 916 | 0.012 | 0.978 | 0.01 |
| 917 | 0.009 | 0.975 | 0.016 |
| 918 | 0.017 | 0.972 | 0.012 |
| 919 | 0.019 | 0.966 | 0.015 |
| 920 | 0.383 | 0.611 | 0.006 |
| 921 | 0.026 | 0.959 | 0.015 |
| 922 | 0.008 | 0.979 | 0.013 |
| 923 | 0.418 | 0.573 | 0.009 |
| 924 | 0.012 | 0.973 | 0.014 |
| 925 | 0.015 | 0.979 | 0.005 |
| 926 | 0.016 | 0.964 | 0.019 |
| 927 | 0.051 | 0.854 | 0.094 |
| 928 | 0.014 | 0.98 | 0.006 |
| 929 | 0.008 | 0.987 | 0.005 |
| 930 | 0.155 | 0.836 | 0.008 |
| 931 | 0.011 | 0.972 | 0.016 |
| 932 | 0.238 | 0.757 | 0.005 |
| 933 | 0.005 | 0.901 | 0.093 |
| 934 | 0.076 | 0.916 | 0.008 |
| 935 | 0.083 | 0.385 | 0.532 |
| 936 | 0.019 | 0.019 | 0.962 |
| 937 | 0.006 | 0.006 | 0.988 |
| 938 | 0.024 | 0.135 | 0.842 |
| 939 | 0.007 | 0.049 | 0.944 |
| 940 | 0.008 | 0.027 | 0.964 |
| 941 | 0.009 | 0.006 | 0.985 |
| 942 | 0.19 | 0.151 | 0.659 |
| 943 | 0.025 | 0.077 | 0.897 |
| 944 | 0.02 | 0.016 | 0.964 |
| 945 | 0.064 | 0.93 | 0.007 |
| 946 | 0.012 | 0.036 | 0.952 |
| 947 | 0.009 | 0.915 | 0.075 |
| 948 | 0.007 | 0.987 | 0.007 |
| 949 | 0.006 | 0.986 | 0.008 |
| 950 | 0.012 | 0.319 | 0.669 |
| 951 | 0.01 | 0.007 | 0.983 |
| 952 | 0.007 | 0.028 | 0.966 |
| 953 | 0.008 | 0.965 | 0.027 |
| 954 | 0.011 | 0.034 | 0.955 |
| 955 | 0.007 | 0.021 | 0.973 |
| 956 | 0.05 | 0.016 | 0.934 |
| 957 | 0.009 | 0.009 | 0.982 |
| 958 | 0.007 | 0.021 | 0.971 |
| 959 | 0.004 | 0.007 | 0.988 |
| 960 | 0.009 | 0.01 | 0.982 |
| 961 | 0.025 | 0.012 | 0.963 |
| 962 | 0.009 | 0.008 | 0.983 |
| 963 | 0.011 | 0.033 | 0.956 |
| 964 | 0.016 | 0.009 | 0.975 |
| 965 | 0.013 | 0.01 | 0.977 |
| 966 | 0.005 | 0.005 | 0.991 |
| 967 | 0.014 | 0.017 | 0.969 |
| 968 | 0.021 | 0.01 | 0.969 |
| 969 | 0.123 | 0.038 | 0.839 |
| 970 | 0.01 | 0.006 | 0.984 |
| 971 | 0.005 | 0.009 | 0.986 |
| 972 | 0.02 | 0.041 | 0.939 |
| 973 | 0.009 | 0.017 | 0.974 |
| 974 | 0.009 | 0.01 | 0.981 |
| 975 | 0.015 | 0.012 | 0.974 |
| 976 | 0.004 | 0.007 | 0.989 |
| 977 | 0.037 | 0.005 | 0.958 |
| 978 | 0.086 | 0.039 | 0.875 |
| 979 | 0.006 | 0.009 | 0.985 |
| 980 | 0.008 | 0.012 | 0.98 |
| 981 | 0.008 | 0.004 | 0.988 |
| 982 | 0.042 | 0.01 | 0.949 |
| 983 | 0.016 | 0.01 | 0.974 |
| 984 | 0.008 | 0.008 | 0.984 |
| 985 | 0.007 | 0.008 | 0.984 |
| 986 | 0.02 | 0.008 | 0.972 |
| 987 | 0.006 | 0.074 | 0.92 |
| 988 | 0.012 | 0.009 | 0.979 |
| 989 | 0.018 | 0.011 | 0.971 |
| 990 | 0.01 | 0.047 | 0.943 |
| 991 | 0.005 | 0.052 | 0.943 |
| 992 | 0.014 | 0.22 | 0.766 |
| 993 | 0.005 | 0.011 | 0.984 |
| 994 | 0.009 | 0.007 | 0.984 |
| 995 | 0.018 | 0.026 | 0.956 |
| 996 | 0.011 | 0.009 | 0.98 |
| 997 | 0.006 | 0.007 | 0.987 |
| 998 | 0.013 | 0.016 | 0.971 |
| 999 | 0.007 | 0.007 | 0.987 |
| 1000 | 0.023 | 0.01 | 0.967 |
| 1001 | 0.005 | 0.009 | 0.986 |
| 1002 | 0.006 | 0.005 | 0.988 |
| 1003 | 0.006 | 0.009 | 0.985 |
| 1004 | 0.005 | 0.021 | 0.974 |
| 1005 | 0.009 | 0.006 | 0.985 |
| 1006 | 0.012 | 0.011 | 0.977 |
| 1007 | 0.007 | 0.006 | 0.987 |
| 1008 | 0.028 | 0.013 | 0.959 |
| 1009 | 0.007 | 0.009 | 0.984 |
| 1010 | 0.011 | 0.051 | 0.938 |
| 1011 | 0.008 | 0.009 | 0.984 |
| 1012 | 0.008 | 0.016 | 0.976 |
| 1013 | 0.01 | 0.014 | 0.976 |
| 1014 | 0.012 | 0.009 | 0.979 |
| 1015 | 0.014 | 0.119 | 0.867 |
| 1016 | 0.008 | 0.006 | 0.985 |
| 1017 | 0.008 | 0.007 | 0.985 |
| 1018 | 0.009 | 0.015 | 0.976 |
| 1019 | 0.014 | 0.027 | 0.959 |
| 1020 | 0.053 | 0.054 | 0.894 |
| 1021 | 0.016 | 0.037 | 0.946 |
| 1022 | 0.005 | 0.028 | 0.968 |
| 1023 | 0.008 | 0.013 | 0.979 |
| 1024 | 0.007 | 0.009 | 0.984 |
| 1025 | 0.005 | 0.025 | 0.97 |
| 1026 | 0.009 | 0.011 | 0.98 |